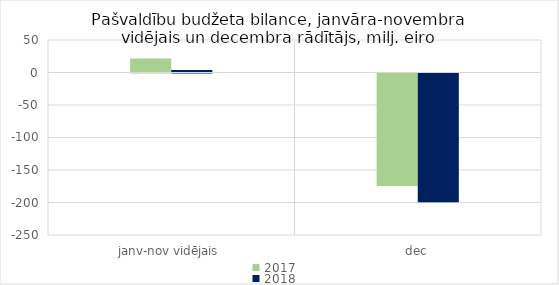
| Category | 2017 | 2018 |
|---|---|---|
| janv-nov vidējais | 21438.737 | 3830.872 |
| dec | -172941.944 | -198139.706 |